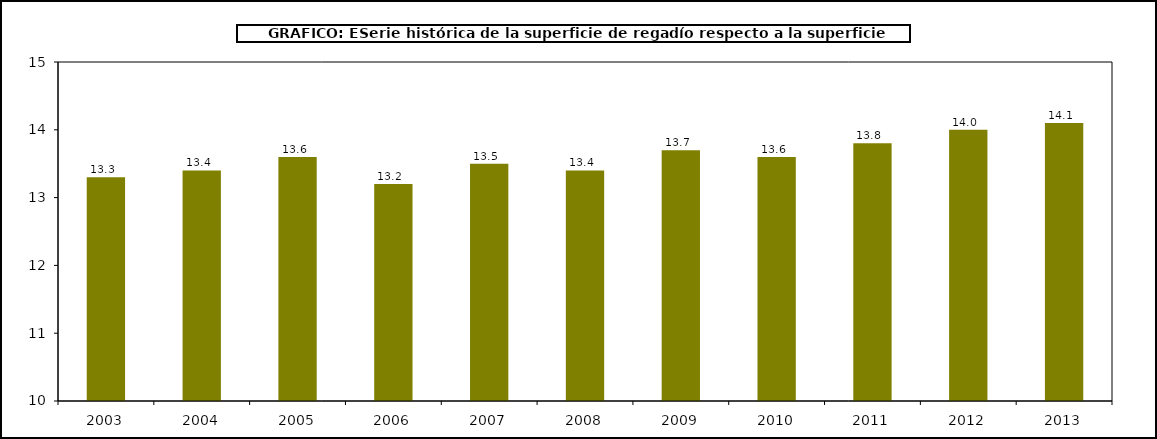
| Category | Series 2 |
|---|---|
| 2003.0 | 13.3 |
| 2004.0 | 13.4 |
| 2005.0 | 13.6 |
| 2006.0 | 13.2 |
| 2007.0 | 13.5 |
| 2008.0 | 13.4 |
| 2009.0 | 13.7 |
| 2010.0 | 13.6 |
| 2011.0 | 13.8 |
| 2012.0 | 14 |
| 2013.0 | 14.1 |